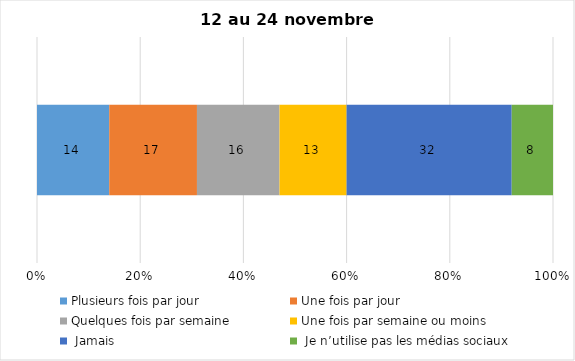
| Category | Plusieurs fois par jour | Une fois par jour | Quelques fois par semaine   | Une fois par semaine ou moins   |  Jamais   |  Je n’utilise pas les médias sociaux |
|---|---|---|---|---|---|---|
| 0 | 14 | 17 | 16 | 13 | 32 | 8 |